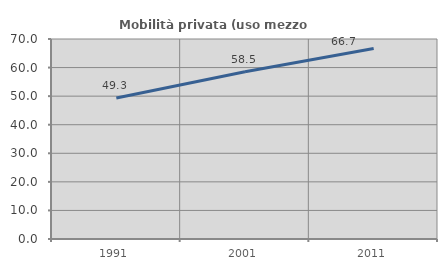
| Category | Mobilità privata (uso mezzo privato) |
|---|---|
| 1991.0 | 49.342 |
| 2001.0 | 58.519 |
| 2011.0 | 66.667 |